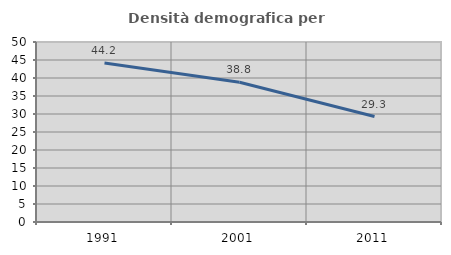
| Category | Densità demografica |
|---|---|
| 1991.0 | 44.156 |
| 2001.0 | 38.802 |
| 2011.0 | 29.3 |